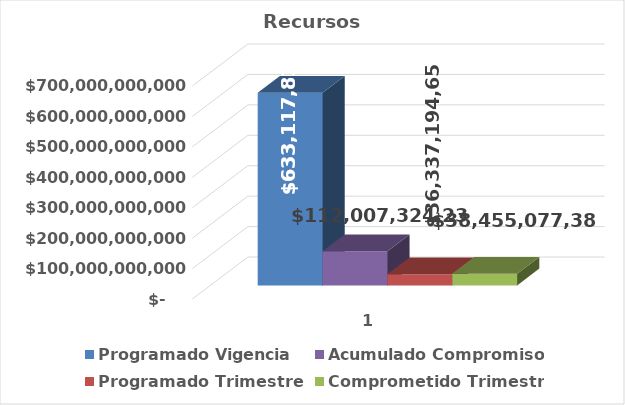
| Category | Programado Vigencia | Acumulado Compromisos | Programado Trimestre | Comprometido Trimestre |
|---|---|---|---|---|
| 0 | 633117837570 | 112007324232.07 | 36337194653 | 38455077381.66 |